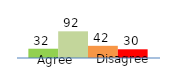
| Category | Series 0 | Series 1 | Series 2 | Series 3 |
|---|---|---|---|---|
| 0 | 32 | 92 | 42 | 30 |